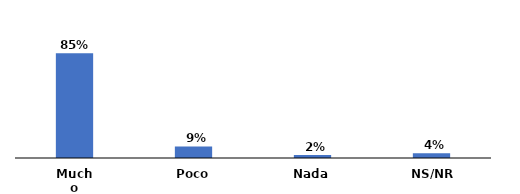
| Category | Series 0 |
|---|---|
| Mucho | 0.845 |
| Poco | 0.093 |
| Nada | 0.024 |
| NS/NR | 0.038 |